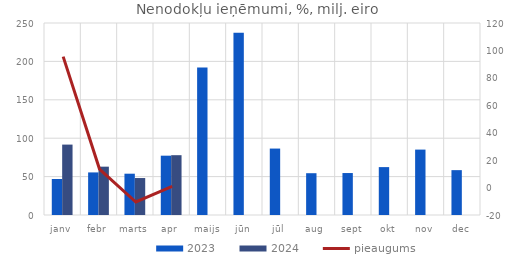
| Category | 2023 | 2024 |
|---|---|---|
| janv | 46.896 | 91.674 |
| febr | 55.445 | 62.936 |
| marts | 53.782 | 48.128 |
| apr | 77.237 | 77.884 |
| maijs | 192.092 | 0 |
| jūn | 237.322 | 0 |
| jūl | 86.507 | 0 |
| aug | 54.412 | 0 |
| sept | 54.638 | 0 |
| okt | 62.367 | 0 |
| nov | 85.157 | 0 |
| dec | 58.406 | 0 |